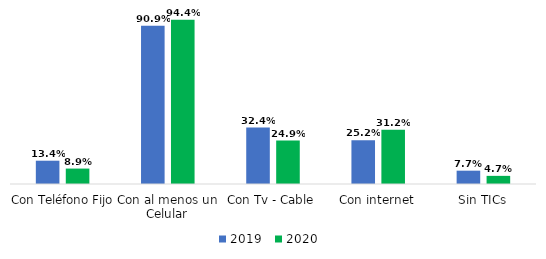
| Category | 2019 | 2020 |
|---|---|---|
| Con Teléfono Fijo | 0.134 | 0.089 |
| Con al menos un Celular | 0.909 | 0.944 |
| Con Tv - Cable | 0.324 | 0.249 |
| Con internet | 0.252 | 0.312 |
| Sin TICs | 0.077 | 0.047 |